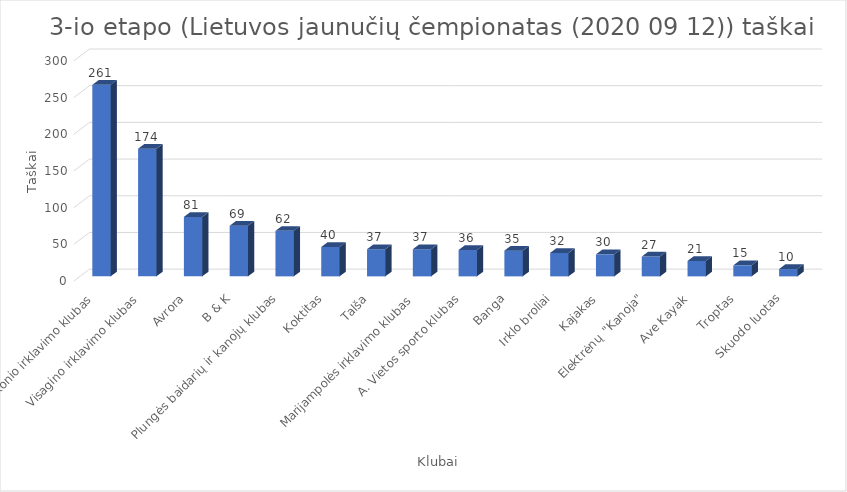
| Category | Series 0 |
|---|---|
| V. Vaičikonio irklavimo klubas | 261 |
| Visagino irklavimo klubas | 174 |
| Avrora | 81 |
| B & K | 69 |
| Plungės baidarių ir kanojų klubas | 62 |
| Koktitas | 40 |
| Talša | 37 |
| Marijampolės irklavimo klubas | 37 |
| A. Vietos sporto klubas | 36 |
| Banga | 35 |
| Irklo broliai | 32 |
| Kajakas | 30 |
| Elektrėnų "Kanoja" | 27 |
| Ave Kayak | 21 |
| Troptas | 15 |
| Skuodo luotas | 10 |